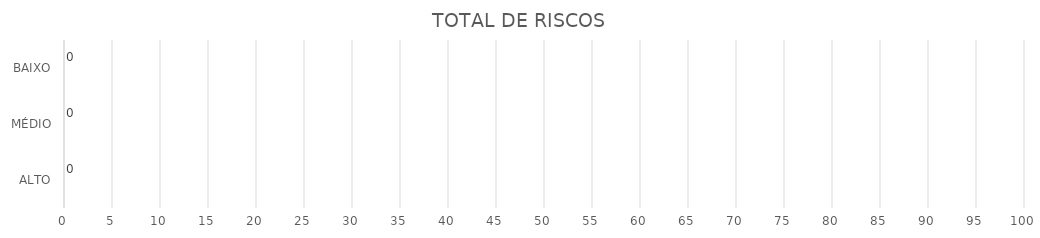
| Category | Series 1 | Series 0 |
|---|---|---|
| ALTO | 0 | 0 |
| MÉDIO | 0 | 0 |
| BAIXO | 0 | 0 |